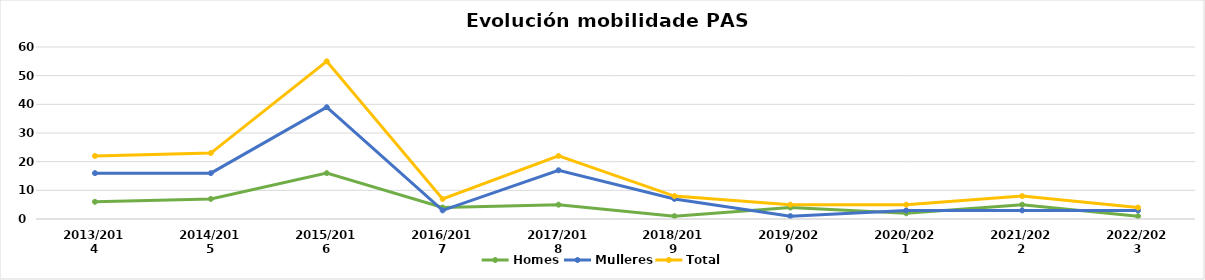
| Category | Homes | Mulleres | Total |
|---|---|---|---|
| 2013/2014 | 6 | 16 | 22 |
| 2014/2015 | 7 | 16 | 23 |
| 2015/2016 | 16 | 39 | 55 |
| 2016/2017 | 4 | 3 | 7 |
| 2017/2018 | 5 | 17 | 22 |
| 2018/2019 | 1 | 7 | 8 |
| 2019/2020 | 4 | 1 | 5 |
| 2020/2021 | 2 | 3 | 5 |
| 2021/2022 | 5 | 3 | 8 |
| 2022/2023 | 1 | 3 | 4 |